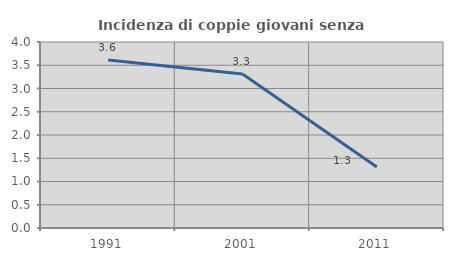
| Category | Incidenza di coppie giovani senza figli |
|---|---|
| 1991.0 | 3.614 |
| 2001.0 | 3.311 |
| 2011.0 | 1.31 |